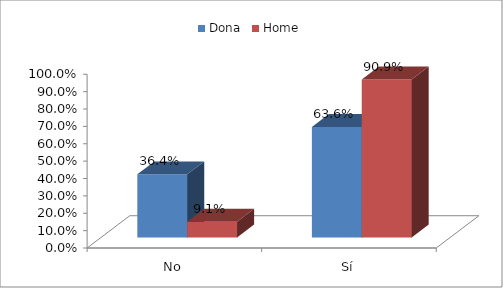
| Category | Dona | Home |
|---|---|---|
| No | 0.364 | 0.091 |
| Sí | 0.636 | 0.909 |